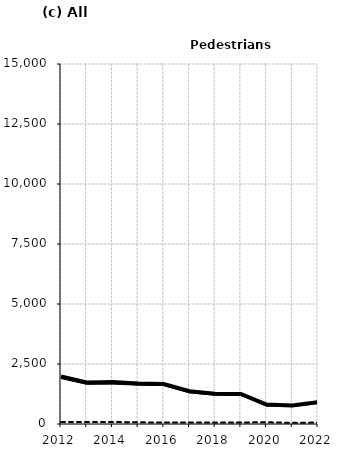
| Category | Built-up | Non built-up | Total |
|---|---|---|---|
| 2012.0 | 1893 | 86 | 1979 |
| 2013.0 | 1653 | 81 | 1734 |
| 2014.0 | 1662 | 83 | 1745 |
| 2015.0 | 1619 | 71 | 1690 |
| 2016.0 | 1600 | 63 | 1663 |
| 2017.0 | 1298 | 65 | 1363 |
| 2018.0 | 1199 | 57 | 1256 |
| 2019.0 | 1189 | 64 | 1253 |
| 2020.0 | 740 | 73 | 813 |
| 2021.0 | 723 | 48 | 771 |
| 2022.0 | 851 | 61 | 912 |